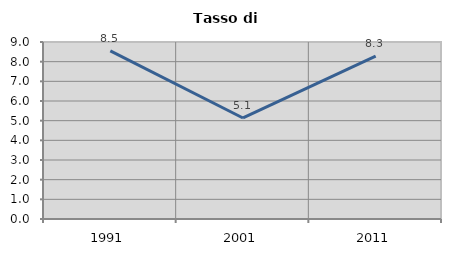
| Category | Tasso di disoccupazione   |
|---|---|
| 1991.0 | 8.545 |
| 2001.0 | 5.137 |
| 2011.0 | 8.285 |